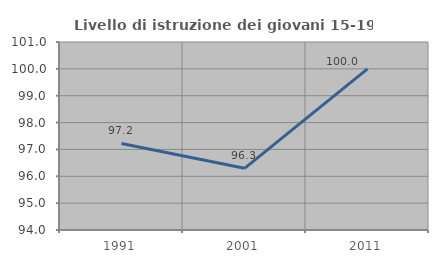
| Category | Livello di istruzione dei giovani 15-19 anni |
|---|---|
| 1991.0 | 97.222 |
| 2001.0 | 96.296 |
| 2011.0 | 100 |